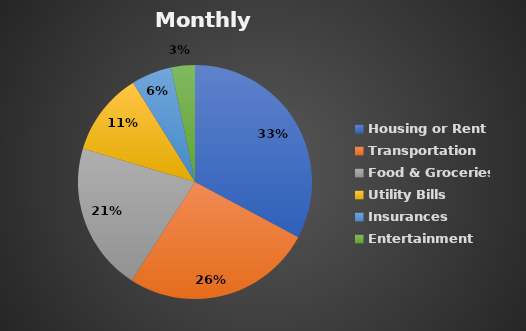
| Category |  Amount  |
|---|---|
| Housing or Rent | 999 |
| Transportation | 800 |
| Food & Groceries | 625 |
| Utility Bills | 350 |
| Insurances | 170 |
| Entertainment | 100 |